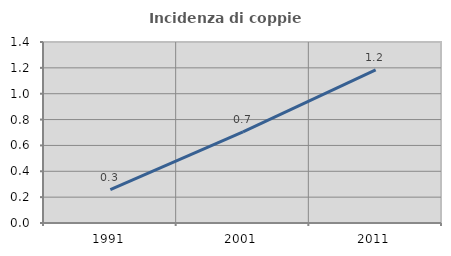
| Category | Incidenza di coppie miste |
|---|---|
| 1991.0 | 0.259 |
| 2001.0 | 0.704 |
| 2011.0 | 1.185 |